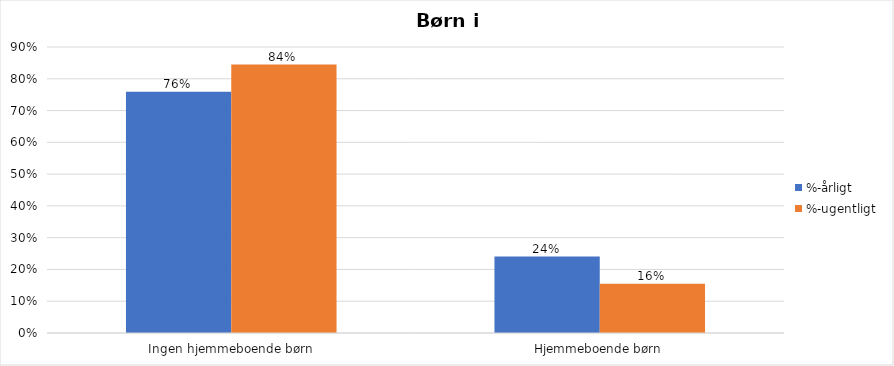
| Category | %-årligt | %-ugentligt |
|---|---|---|
| Ingen hjemmeboende børn | 0.759 | 0.845 |
| Hjemmeboende børn | 0.241 | 0.155 |